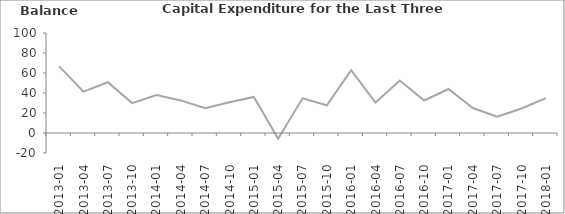
| Category | Balance |
|---|---|
| 2013-01 | 66.6 |
| 2013-04 | 41.4 |
| 2013-07 | 50.8 |
| 2013-10 | 29.9 |
| 2014-01 | 38 |
| 2014-04 | 32.6 |
| 2014-07 | 24.8 |
| 2014-10 | 30.8 |
| 2015-01 | 36.1 |
| 2015-04 | -5.7 |
| 2015-07 | 34.7 |
| 2015-10 | 27.7 |
| 2016-01 | 62.9 |
| 2016-04 | 30.4 |
| 2016-07 | 52.5 |
| 2016-10 | 32.5 |
| 2017-01 | 44 |
| 2017-04 | 25 |
| 2017-07 | 16.3 |
| 2017-10 | 24.5 |
| 2018-01 | 34.8 |